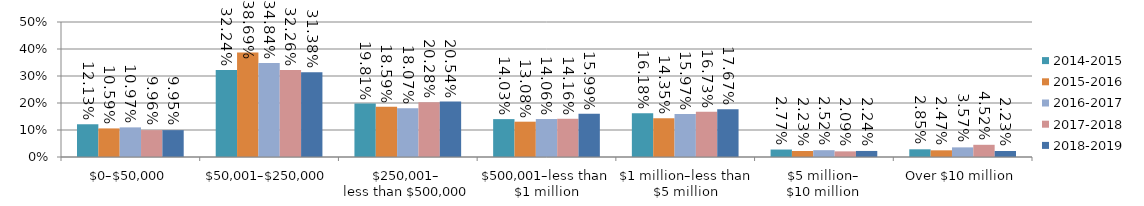
| Category | 2014-2015 | 2015-2016 | 2016-2017 | 2017-2018 | 2018-2019 |
|---|---|---|---|---|---|
| $0–$50,000 | 0.121 | 0.106 | 0.11 | 0.1 | 0.099 |
| $50,001–$250,000 | 0.322 | 0.387 | 0.348 | 0.323 | 0.314 |
| $250,001–
less than $500,000 | 0.198 | 0.186 | 0.181 | 0.203 | 0.205 |
| $500,001–less than $1 million | 0.14 | 0.131 | 0.141 | 0.142 | 0.16 |
| $1 million–less than $5 million | 0.162 | 0.143 | 0.16 | 0.167 | 0.177 |
| $5 million–
$10 million | 0.028 | 0.022 | 0.025 | 0.021 | 0.022 |
| Over $10 million | 0.028 | 0.025 | 0.036 | 0.045 | 0.022 |